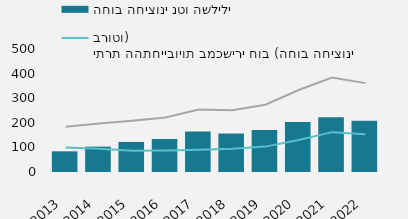
| Category | החוב החיצוני נטו השלילי |
|---|---|
| 2013 | 84.105 |
| 2014 | 103.091 |
| 2015 | 122.16 |
| 2016 | 134.149 |
| 2017 | 164.164 |
| 2018 | 156.359 |
| 2019 | 170.257 |
| 2020 | 202.924 |
| 2021 | 222.225 |
| 2022 | 208.246 |